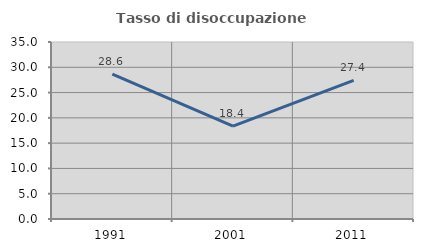
| Category | Tasso di disoccupazione giovanile  |
|---|---|
| 1991.0 | 28.633 |
| 2001.0 | 18.384 |
| 2011.0 | 27.419 |